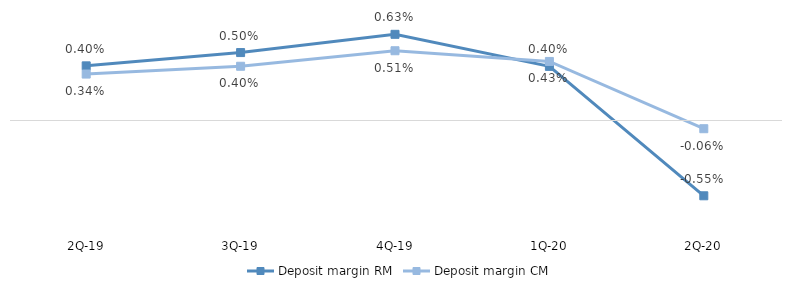
| Category | Deposit margin RM | Deposit margin CM |
|---|---|---|
| 2Q-20 | -0.006 | -0.001 |
| 1Q-20 | 0.004 | 0.004 |
| 4Q-19 | 0.006 | 0.005 |
| 3Q-19 | 0.005 | 0.004 |
| 2Q-19 | 0.004 | 0.003 |